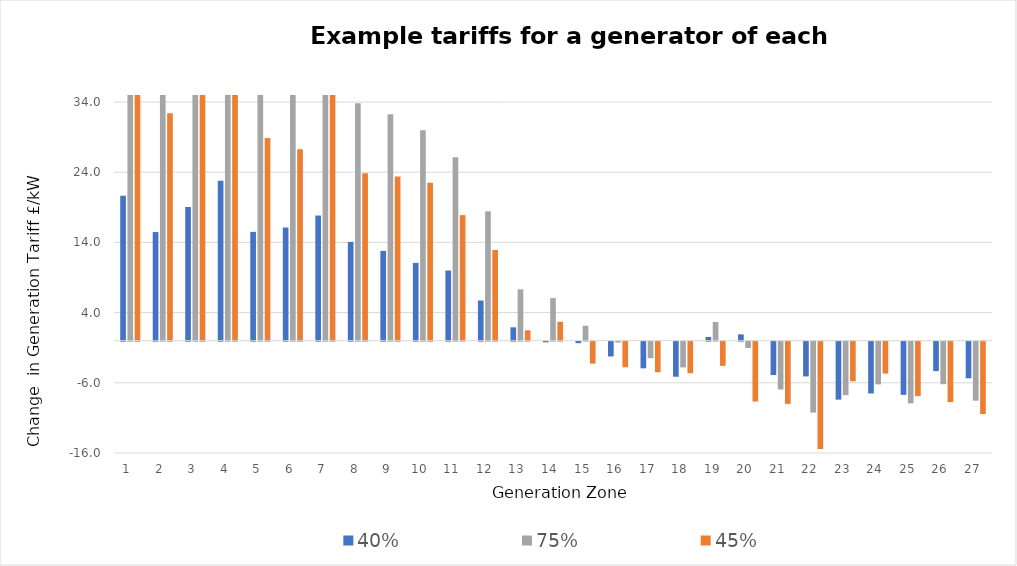
| Category | 40% | 75% | 45% |
|---|---|---|---|
| 1.0 | 20.663 | 50.785 | 40.712 |
| 2.0 | 15.475 | 40.613 | 32.405 |
| 3.0 | 19.06 | 45.836 | 35.288 |
| 4.0 | 22.776 | 55.295 | 44.86 |
| 5.0 | 15.501 | 38.334 | 28.88 |
| 6.0 | 16.12 | 37.976 | 27.286 |
| 7.0 | 17.831 | 44.956 | 36.144 |
| 8.0 | 14.07 | 33.828 | 23.865 |
| 9.0 | 12.79 | 32.244 | 23.375 |
| 10.0 | 11.08 | 29.976 | 22.511 |
| 11.0 | 9.997 | 26.116 | 17.884 |
| 12.0 | 5.723 | 18.435 | 12.916 |
| 13.0 | 1.903 | 7.318 | 1.47 |
| 14.0 | -0.086 | 6.067 | 2.699 |
| 15.0 | -0.211 | 2.13 | -3.122 |
| 16.0 | -2.104 | -0.127 | -3.642 |
| 17.0 | -3.794 | -2.354 | -4.35 |
| 18.0 | -4.995 | -3.661 | -4.488 |
| 19.0 | 0.534 | 2.669 | -3.438 |
| 20.0 | 0.899 | -0.907 | -8.527 |
| 21.0 | -4.751 | -6.815 | -8.858 |
| 22.0 | -4.95 | -10.105 | -15.29 |
| 23.0 | -8.256 | -7.623 | -5.642 |
| 24.0 | -7.38 | -6.088 | -4.545 |
| 25.0 | -7.572 | -8.777 | -7.754 |
| 26.0 | -4.191 | -6.058 | -8.605 |
| 27.0 | -5.214 | -8.403 | -10.305 |